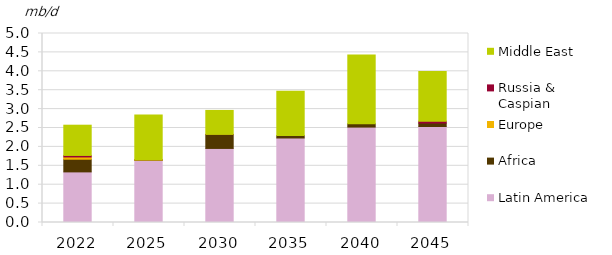
| Category | Latin America | Africa | Europe | Russia & Caspian | Middle East |
|---|---|---|---|---|---|
| 2022.0 | 1.339 | 0.335 | 0.06 | 0.04 | 0.8 |
| 2025.0 | 1.649 | 0.003 | 0.002 | 0 | 1.19 |
| 2030.0 | 1.959 | 0.369 | 0 | 0.002 | 0.635 |
| 2035.0 | 2.236 | 0.065 | 0 | 0 | 1.168 |
| 2040.0 | 2.524 | 0.087 | 0 | 0 | 1.823 |
| 2045.0 | 2.54 | 0.091 | 0 | 0.049 | 1.315 |